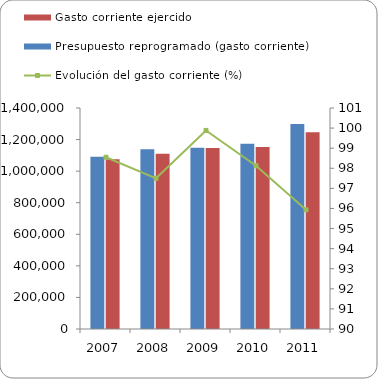
| Category | Presupuesto reprogramado (gasto corriente) | Gasto corriente ejercido |
|---|---|---|
| 2007 | 1091239 | 1075414 |
| 2008 | 1137935.9 | 1109495 |
| 2009 | 1148009 | 1146665 |
| 2010 | 1174208 | 1152188.9 |
| 2011 | 1298971.1 | 1246165.5 |